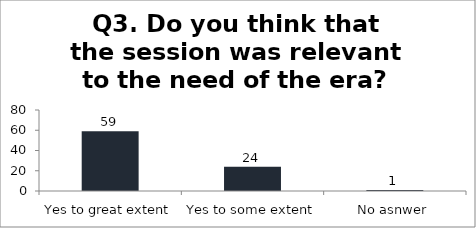
| Category | Q3. Do you think that the session was relevant to the need of the era? |
|---|---|
| Yes to great extent | 59 |
| Yes to some extent | 24 |
| No asnwer | 1 |